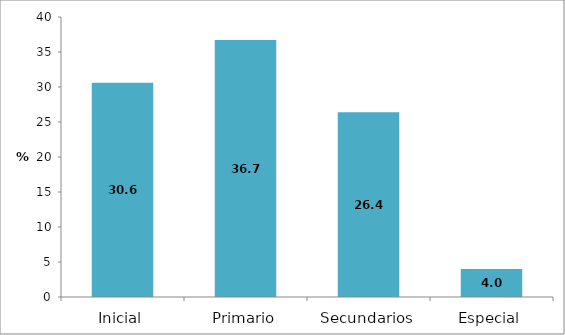
| Category | Series 0 |
|---|---|
| Inicial | 30.6 |
| Primario | 36.7 |
| Secundarios | 26.4 |
| Especial | 4 |